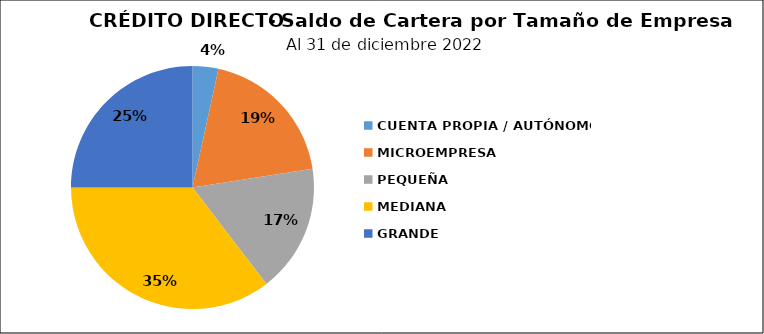
| Category | Saldo | Créditos |
|---|---|---|
| CUENTA PROPIA / AUTÓNOMO | 6.259 | 4 |
| MICROEMPRESA | 34.771 | 15 |
| PEQUEÑA | 31.093 | 30 |
| MEDIANA | 64.538 | 27 |
| GRANDE | 45.55 | 17 |